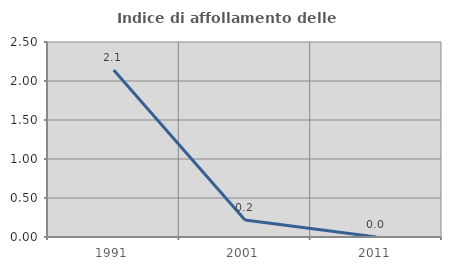
| Category | Indice di affollamento delle abitazioni  |
|---|---|
| 1991.0 | 2.14 |
| 2001.0 | 0.217 |
| 2011.0 | 0 |